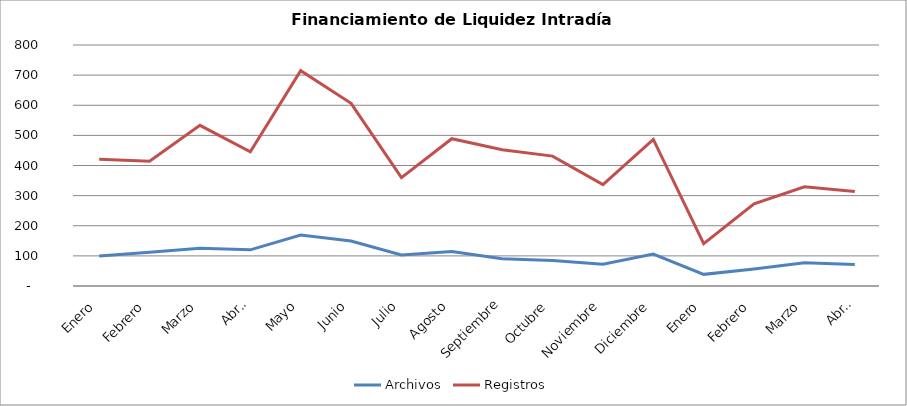
| Category | Archivos | Registros |
|---|---|---|
| Enero | 99.429 | 420.762 |
| Febrero | 112.4 | 413.85 |
| Marzo | 125.696 | 533.348 |
| Abril | 120.05 | 445.35 |
| Mayo | 169.455 | 714.909 |
| Junio | 149.095 | 606.524 |
| Julio | 103 | 359.524 |
| Agosto | 114.5 | 488.909 |
| Septiembre | 90.81 | 452.048 |
| Octubre | 84.421 | 431.158 |
| Noviembre | 72.476 | 336.619 |
| Diciembre | 106.19 | 486.619 |
| Enero | 38.682 | 140.636 |
| Febrero | 56.286 | 272.667 |
| Marzo | 77.273 | 329.409 |
| Abril | 71.6 | 313.35 |